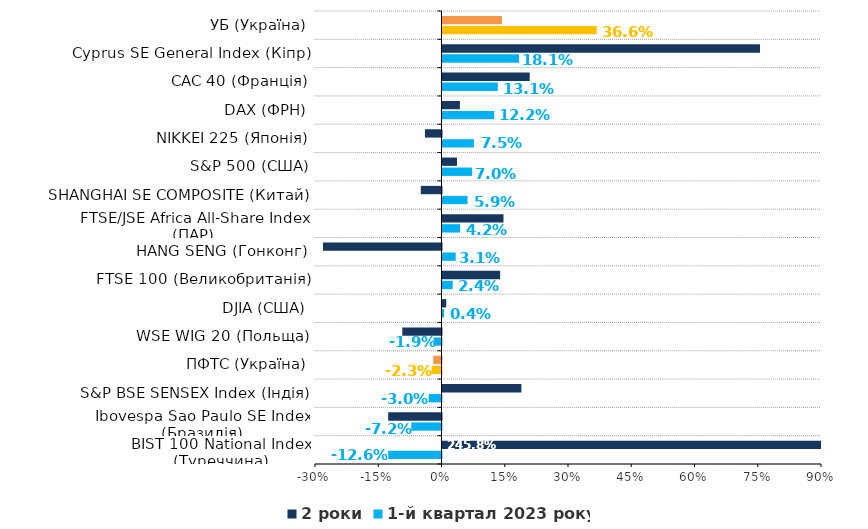
| Category | 1-й квартал 2023 року | 2 роки |
|---|---|---|
| BIST 100 National Index (Туреччина) | -0.126 | 2.458 |
| Ibovespa Sao Paulo SE Index (Бразилія) | -0.072 | -0.126 |
| S&P BSE SENSEX Index (Індія) | -0.03 | 0.187 |
| ПФТС (Україна) | -0.023 | -0.019 |
| WSE WIG 20 (Польща) | -0.019 | -0.093 |
| DJIA (США) | 0.004 | 0.009 |
| FTSE 100 (Великобританія) | 0.024 | 0.137 |
| HANG SENG (Гонконг) | 0.031 | -0.281 |
| FTSE/JSE Africa All-Share Index (ПАР) | 0.042 | 0.145 |
| SHANGHAI SE COMPOSITE (Китай) | 0.059 | -0.049 |
| S&P 500 (США) | 0.07 | 0.034 |
| NIKKEI 225 (Японія) | 0.075 | -0.039 |
| DAX (ФРН) | 0.122 | 0.041 |
| CAC 40 (Франція) | 0.131 | 0.207 |
| Cyprus SE General Index (Кіпр) | 0.181 | 0.753 |
| УБ (Україна) | 0.366 | 0.141 |